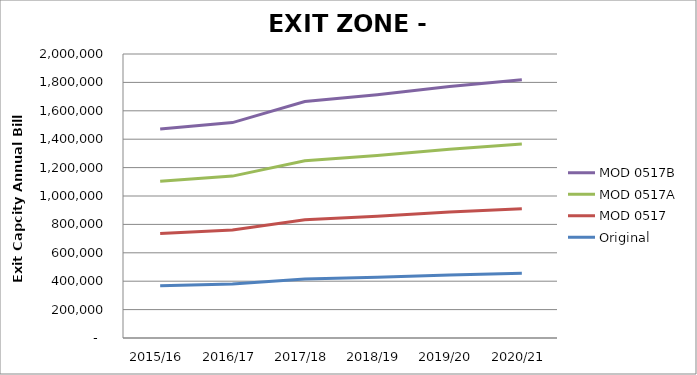
| Category | Original | MOD 0517 | MOD 0517A | MOD 0517B |
|---|---|---|---|---|
| 2015/16 | 367951.805 | 367951.805 | 367951.805 | 367951.805 |
| 2016/17 | 380015.798 | 380015.798 | 380015.798 | 376999.8 |
| 2017/18 | 416207.779 | 416207.779 | 416207.779 | 416207.779 |
| 2018/19 | 428271.773 | 428271.773 | 428271.773 | 428271.773 |
| 2019/20 | 443351.765 | 443351.765 | 443351.765 | 440335.766 |
| 2020/21 | 455415.758 | 455415.758 | 455415.758 | 452399.76 |